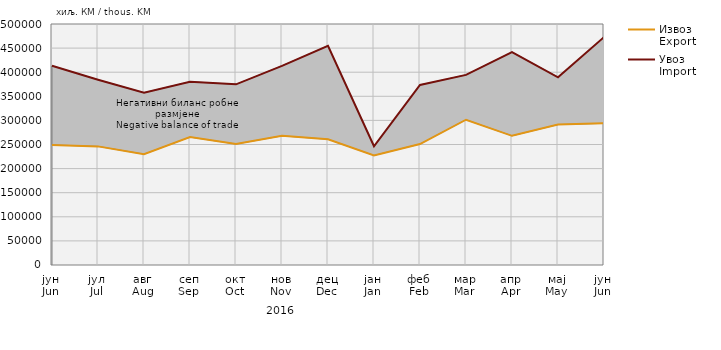
| Category | Извоз
Export | Увоз
Import |
|---|---|---|
| јун
Jun | 249061 | 413226 |
| јул
Jul | 246093 | 384444 |
| авг
Aug | 229988 | 357450 |
| сеп
Sep | 265387 | 380274 |
| окт
Oct | 250954 | 374802 |
| нов
Nov | 267945 | 413271 |
| дец
Dec | 260835 | 454746 |
| јан
Jan | 227365 | 246360 |
| феб
Feb | 250990 | 373425 |
| мар
Mar | 301409 | 394461 |
| апр
Apr | 267986 | 441828 |
| мај
May | 291348 | 389494 |
| јун
Jun | 293917 | 472796 |